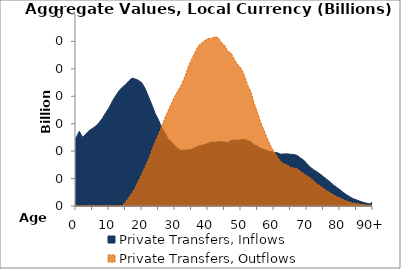
| Category | Private Transfers, Inflows | Private Transfers, Outflows |
|---|---|---|
| 0 | 24.76 | 0 |
|  | 27.233 | 0 |
| 2 | 25.073 | 0 |
| 3 | 26.243 | 0 |
| 4 | 27.53 | 0 |
| 5 | 28.3 | 0 |
| 6 | 29.134 | 0 |
| 7 | 30.401 | 0 |
| 8 | 31.945 | 0 |
| 9 | 33.957 | 0 |
| 10 | 35.755 | 0 |
| 11 | 38.162 | 0 |
| 12 | 40.116 | 0 |
| 13 | 41.93 | 0 |
| 14 | 43.263 | 0 |
| 15 | 44.249 | 1.414 |
| 16 | 45.581 | 2.99 |
| 17 | 46.622 | 4.757 |
| 18 | 46.261 | 6.727 |
| 19 | 45.782 | 9.327 |
| 20 | 44.803 | 11.665 |
| 21 | 42.7 | 14.377 |
| 22 | 39.759 | 16.971 |
| 23 | 36.865 | 20.317 |
| 24 | 33.703 | 23.305 |
| 25 | 31.336 | 26.059 |
| 26 | 28.439 | 28.985 |
| 27 | 26.474 | 32.288 |
| 28 | 24.279 | 34.925 |
| 29 | 23.275 | 37.612 |
| 30 | 21.91 | 40.143 |
| 31 | 20.858 | 42.214 |
| 32 | 20.244 | 44.322 |
| 33 | 20.42 | 47.135 |
| 34 | 20.386 | 50.658 |
| 35 | 20.65 | 53.425 |
| 36 | 21.169 | 55.778 |
| 37 | 21.8 | 58.251 |
| 38 | 22.087 | 59.412 |
| 39 | 22.398 | 60.298 |
| 40 | 22.782 | 61.025 |
| 41 | 23.304 | 61.102 |
| 42 | 23.234 | 61.627 |
| 43 | 23.401 | 61.423 |
| 44 | 23.457 | 59.664 |
| 45 | 23.274 | 58.624 |
| 46 | 23.107 | 56.478 |
| 47 | 23.808 | 55.699 |
| 48 | 24.015 | 53.366 |
| 49 | 23.98 | 51.57 |
| 50 | 24.126 | 50.275 |
| 51 | 24.315 | 47.64 |
| 52 | 23.787 | 44.075 |
| 53 | 23.399 | 41.59 |
| 54 | 22.196 | 37.364 |
| 55 | 21.806 | 34.068 |
| 56 | 20.956 | 30.291 |
| 57 | 20.555 | 27.461 |
| 58 | 20.06 | 24.55 |
| 59 | 19.862 | 21.84 |
| 60 | 19.587 | 19.696 |
| 61 | 19.405 | 17.96 |
| 62 | 18.893 | 16.158 |
| 63 | 18.968 | 15.371 |
| 64 | 19.005 | 14.873 |
| 65 | 18.85 | 14.044 |
| 66 | 18.759 | 13.824 |
| 67 | 18.465 | 13.607 |
| 68 | 17.516 | 12.588 |
| 69 | 16.723 | 11.781 |
| 70 | 15.396 | 10.903 |
| 71 | 14.161 | 10.203 |
| 72 | 13.243 | 9.202 |
| 73 | 12.485 | 8.054 |
| 74 | 11.613 | 7.289 |
| 75 | 10.668 | 6.362 |
| 76 | 9.726 | 5.51 |
| 77 | 8.759 | 4.799 |
| 78 | 7.678 | 4.033 |
| 79 | 6.804 | 3.37 |
| 80 | 5.915 | 2.853 |
| 81 | 4.949 | 2.277 |
| 82 | 4.112 | 1.765 |
| 83 | 3.338 | 1.37 |
| 84 | 2.658 | 1.063 |
| 85 | 2.228 | 0.858 |
| 86 | 1.766 | 0.66 |
| 87 | 1.355 | 0.487 |
| 88 | 1.029 | 0.349 |
| 89 | 0.757 | 0.242 |
| 90+ | 1.576 | 0.473 |